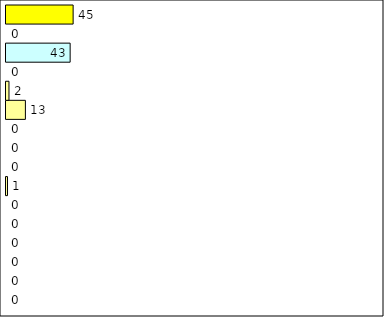
| Category | -2 | -1 | 0 | 1 | 2 | 3 | 4 | 5 | 6 | 7 | 8 | 9 | 10 | 11 | 12 | Perfect Round |
|---|---|---|---|---|---|---|---|---|---|---|---|---|---|---|---|---|
| 0 | 0 | 0 | 0 | 0 | 0 | 0 | 1 | 0 | 0 | 0 | 13 | 2 | 0 | 43 | 0 | 45 |